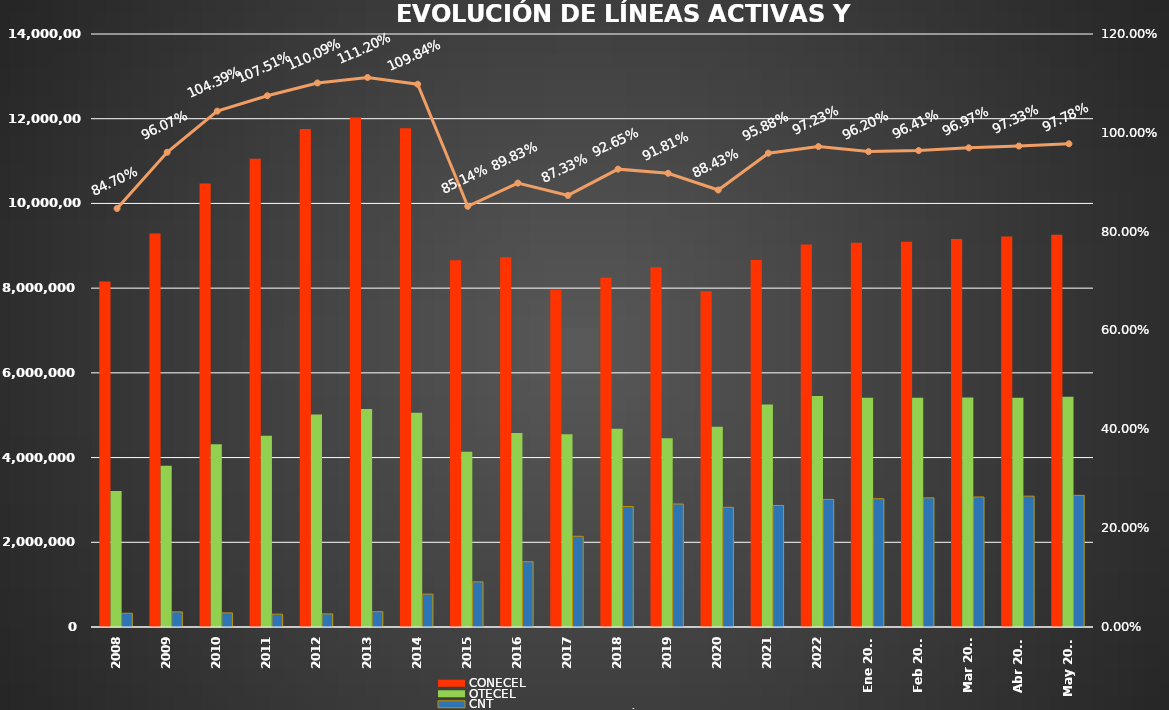
| Category | CONECEL | OTECEL | CNT |
|---|---|---|---|
| 2008 | 8156359 | 3211922 | 323967 |
| 2009 | 9291268 | 3806432 | 356900 |
| 2010 | 10470502 | 4314599 | 333730 |
| 2011 | 11057316 | 4513874 | 303368 |
| 2012 | 11757906 | 5019686 | 309271 |
| 2013 | 12030886 | 5148308 | 362560 |
| 2014 | 11772020 | 5055645 | 776892 |
| 2015 | 8658619 | 4134698 | 1065703 |
| 2016 | 8726823 | 4580092 | 1541219 |
| 2017 | 7960263 | 4549024 | 2142117 |
| 2018 | 8248050 | 4679646 | 2845142 |
| 2019 | 8493054 | 4456356 | 2903690 |
| 2020 | 7929253 | 4729725 | 2826388 |
| 2021 | 8665715 | 5254468 | 2869417 |
| 2022 | 9027737 | 5451115 | 3011899 |
| Ene 2023 | 9073421 | 5411860 | 3028254 |
| Feb 2023 | 9092490 | 5410682 | 3048837 |
| Mar 2023 | 9162562 | 5419670 | 3070611 |
| Abr 2023 | 9220042 | 5409581 | 3089410 |
| May 2023 | 9259499 | 5433930 | 3108405 |